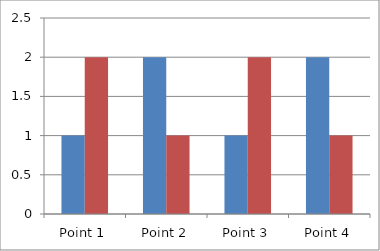
| Category | Series 1 | Series 2 |
|---|---|---|
| Point 1 | 1 | 2 |
| Point 2 | 2 | 1 |
| Point 3 | 1 | 2 |
| Point 4 | 2 | 1 |